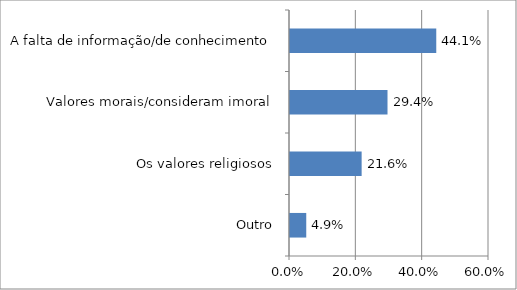
| Category | Series 0 |
|---|---|
| Outro | 0.049 |
| Os valores religiosos | 0.216 |
| Valores morais/consideram imoral | 0.294 |
| A falta de informação/de conhecimento | 0.441 |